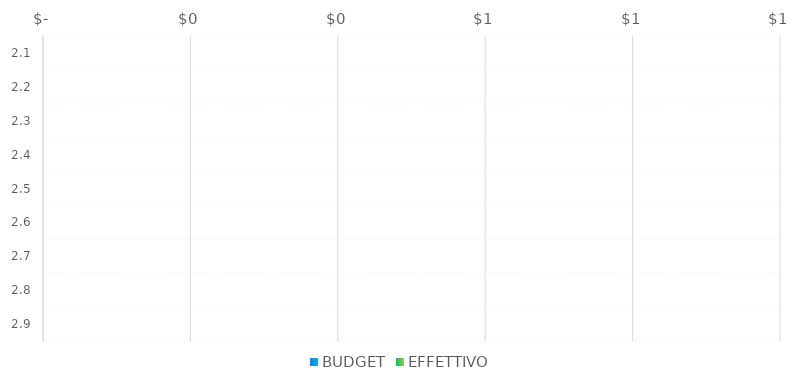
| Category | BUDGET | EFFETTIVO |
|---|---|---|
| 2.1 |  | 0 |
| 2.2 |  | 0 |
| 2.3 |  | 0 |
| 2.4 |  | 0 |
| 2.5 |  | 0 |
| 2.6 |  | 0 |
| 2.7 |  | 0 |
| 2.8 |  | 0 |
| 2.9 |  | 0 |